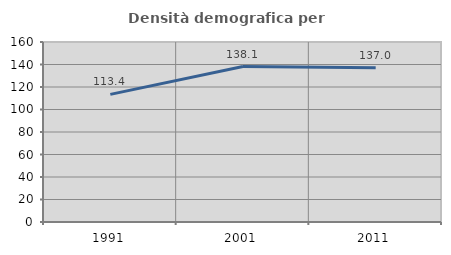
| Category | Densità demografica |
|---|---|
| 1991.0 | 113.441 |
| 2001.0 | 138.142 |
| 2011.0 | 137.044 |